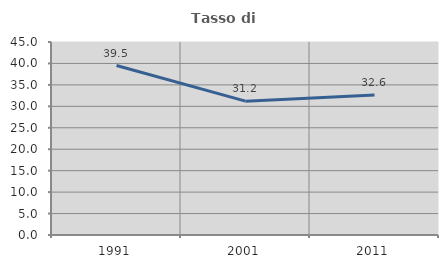
| Category | Tasso di occupazione   |
|---|---|
| 1991.0 | 39.506 |
| 2001.0 | 31.214 |
| 2011.0 | 32.623 |